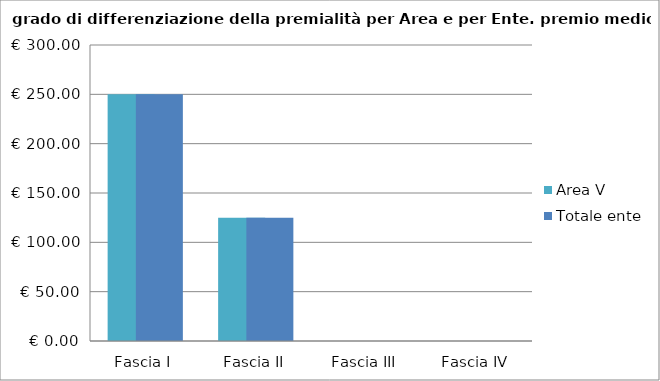
| Category | Area V | Totale ente |
|---|---|---|
| Fascia I | 250 | 250 |
| Fascia II | 125 | 125 |
| Fascia III | 0 | 0 |
| Fascia IV | 0 | 0 |